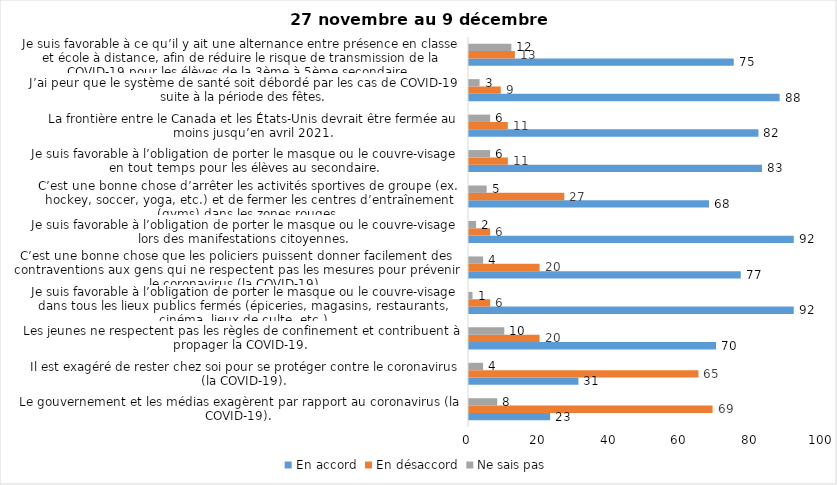
| Category | En accord | En désaccord | Ne sais pas |
|---|---|---|---|
| Le gouvernement et les médias exagèrent par rapport au coronavirus (la COVID-19). | 23 | 69 | 8 |
| Il est exagéré de rester chez soi pour se protéger contre le coronavirus (la COVID-19). | 31 | 65 | 4 |
| Les jeunes ne respectent pas les règles de confinement et contribuent à propager la COVID-19. | 70 | 20 | 10 |
| Je suis favorable à l’obligation de porter le masque ou le couvre-visage dans tous les lieux publics fermés (épiceries, magasins, restaurants, cinéma, lieux de culte, etc.). | 92 | 6 | 1 |
| C’est une bonne chose que les policiers puissent donner facilement des contraventions aux gens qui ne respectent pas les mesures pour prévenir le coronavirus (la COVID-19). | 77 | 20 | 4 |
| Je suis favorable à l’obligation de porter le masque ou le couvre-visage lors des manifestations citoyennes. | 92 | 6 | 2 |
| C’est une bonne chose d’arrêter les activités sportives de groupe (ex. hockey, soccer, yoga, etc.) et de fermer les centres d’entraînement (gyms) dans les zones rouges. | 68 | 27 | 5 |
| Je suis favorable à l’obligation de porter le masque ou le couvre-visage en tout temps pour les élèves au secondaire. | 83 | 11 | 6 |
| La frontière entre le Canada et les États-Unis devrait être fermée au moins jusqu’en avril 2021. | 82 | 11 | 6 |
| J’ai peur que le système de santé soit débordé par les cas de COVID-19 suite à la période des fêtes. | 88 | 9 | 3 |
| Je suis favorable à ce qu’il y ait une alternance entre présence en classe et école à distance, afin de réduire le risque de transmission de la COVID-19 pour les élèves de la 3ème à 5ème secondaire. | 75 | 13 | 12 |